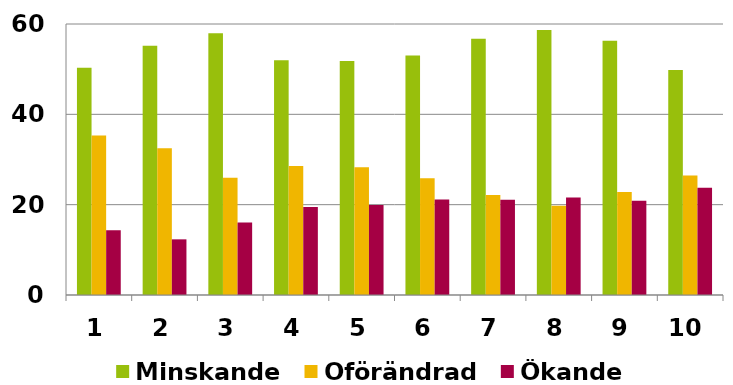
| Category | Minskande | Oförändrad | Ökande |
|---|---|---|---|
| 1.0 | 50.308 | 35.33 | 14.361 |
| 2.0 | 55.179 | 32.5 | 12.321 |
| 3.0 | 57.949 | 25.983 | 16.068 |
| 4.0 | 51.947 | 28.584 | 19.469 |
| 5.0 | 51.826 | 28.261 | 19.913 |
| 6.0 | 53.003 | 25.849 | 21.149 |
| 7.0 | 56.743 | 22.154 | 21.103 |
| 8.0 | 58.673 | 19.735 | 21.593 |
| 9.0 | 56.294 | 22.815 | 20.892 |
| 10.0 | 49.825 | 26.445 | 23.73 |